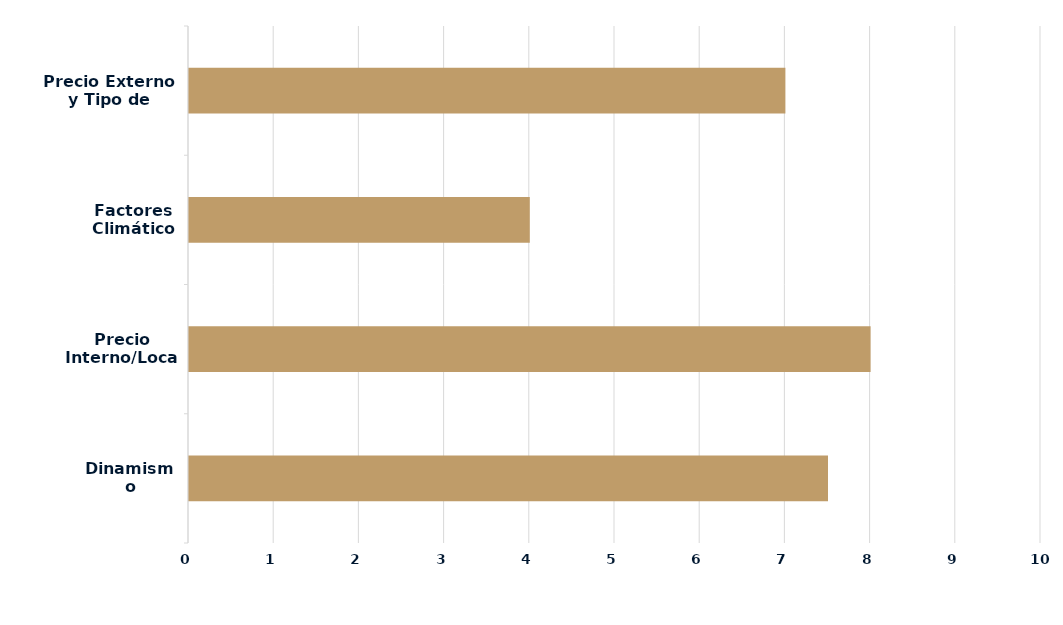
| Category | Series 0 |
|---|---|
| Dinamismo Demanda | 7.5 |
| Precio Interno/Local | 8 |
| Factores Climáticos | 4 |
| Precio Externo y Tipo de Cambio | 7 |